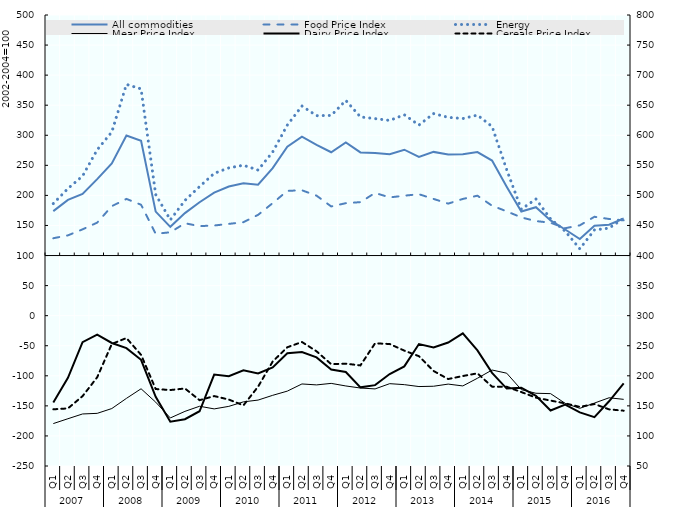
| Category | All commodities | Food Price Index | Energy |
|---|---|---|---|
| 0 | 173.81 | 128.75 | 186.403 |
| 1 | 192.537 | 133.544 | 211.399 |
| 2 | 202.442 | 143.56 | 232.177 |
| 3 | 227.131 | 154.705 | 275.838 |
| 4 | 253.243 | 182.122 | 305.482 |
| 5 | 299.447 | 194.203 | 384.603 |
| 6 | 290.853 | 184.462 | 377.133 |
| 7 | 173.005 | 136.104 | 201.44 |
| 8 | 147.722 | 138.693 | 159.289 |
| 9 | 170.613 | 153.651 | 191.617 |
| 10 | 188.578 | 148.916 | 214.65 |
| 11 | 204.535 | 149.933 | 236.664 |
| 12 | 214.74 | 152.611 | 245.742 |
| 13 | 220.147 | 155.44 | 250.121 |
| 14 | 217.687 | 167.609 | 242.148 |
| 15 | 245.312 | 187.165 | 272.215 |
| 16 | 281.119 | 207.544 | 316.861 |
| 17 | 297.753 | 208.521 | 348.68 |
| 18 | 284.184 | 199.551 | 332.567 |
| 19 | 271.803 | 181.637 | 332.968 |
| 20 | 287.926 | 187.073 | 357.924 |
| 21 | 271.474 | 188.803 | 330.449 |
| 22 | 270.575 | 204.113 | 327.668 |
| 23 | 268.301 | 196.638 | 324.703 |
| 24 | 275.972 | 199.522 | 334.067 |
| 25 | 263.989 | 201.983 | 316.993 |
| 26 | 272.343 | 194.141 | 336.065 |
| 27 | 267.987 | 186.331 | 329.791 |
| 28 | 268.281 | 194.104 | 327.816 |
| 29 | 272.102 | 199.515 | 333.54 |
| 30 | 257.875 | 182.82 | 314.531 |
| 31 | 214.563 | 173.527 | 242.846 |
| 32 | 173.295 | 163.403 | 176.982 |
| 33 | 180.352 | 157.309 | 193.976 |
| 34 | 158.389 | 154.595 | 160.886 |
| 35 | 143.293 | 145.434 | 140.509 |
| 36 | 127.479 | 150.231 | 111.146 |
| 37 | 149.402 | 164.465 | 142.581 |
| 38 | 151.367 | 160.795 | 145.586 |
| 39 | 161.567 | 158.525 | 161.945 |